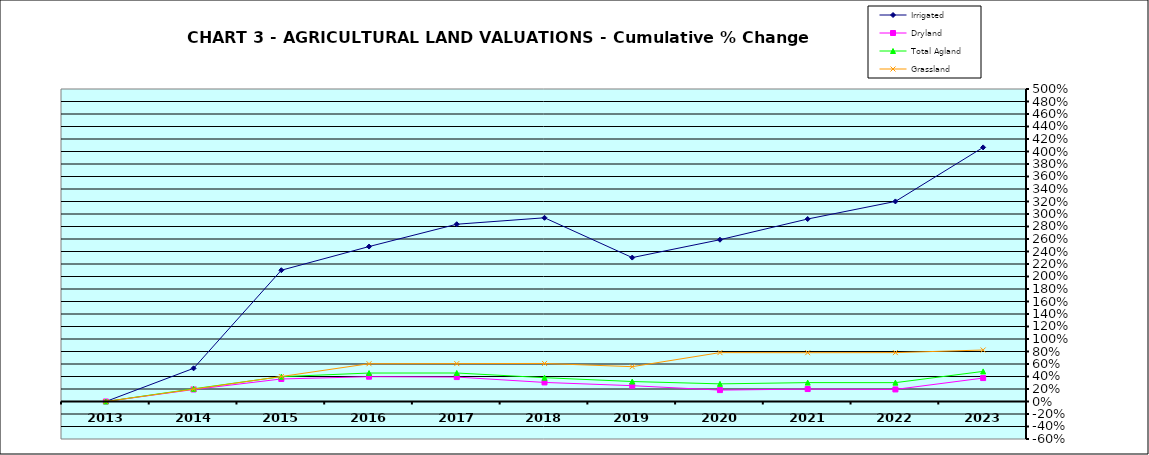
| Category | Irrigated | Dryland | Total Agland | Grassland |
|---|---|---|---|---|
| 2013.0 | 0 | 0 | 0 | 0 |
| 2014.0 | 0.531 | 0.192 | 0.203 | 0.198 |
| 2015.0 | 2.1 | 0.36 | 0.398 | 0.4 |
| 2016.0 | 2.479 | 0.397 | 0.455 | 0.604 |
| 2017.0 | 2.836 | 0.391 | 0.456 | 0.606 |
| 2018.0 | 2.939 | 0.305 | 0.381 | 0.609 |
| 2019.0 | 2.303 | 0.253 | 0.32 | 0.557 |
| 2020.0 | 2.588 | 0.182 | 0.282 | 0.782 |
| 2021.0 | 2.92 | 0.199 | 0.302 | 0.781 |
| 2022.0 | 3.201 | 0.193 | 0.302 | 0.782 |
| 2023.0 | 4.066 | 0.375 | 0.482 | 0.824 |